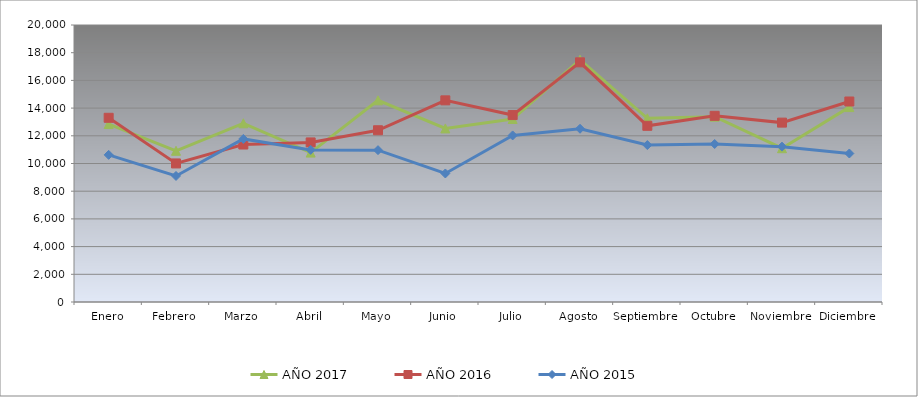
| Category | AÑO 2017 | AÑO 2016 | AÑO 2015 |
|---|---|---|---|
| Enero | 12848.046 | 13300.432 | 10624.273 |
| Febrero | 10917.859 | 10004.343 | 9100.736 |
| Marzo | 12903.846 | 11370.66 | 11773.85 |
| Abril | 10788.503 | 11521.801 | 10982.25 |
| Mayo | 14562.64 | 12400.839 | 10964.138 |
| Junio | 12532.266 | 14559.136 | 9279.725 |
| Julio | 13212.017 | 13496.311 | 12026.353 |
| Agosto | 17493.43 | 17305.071 | 12508.984 |
| Septiembre | 13262.744 | 12721.258 | 11330.64 |
| Octubre | 13381.954 | 13441.9 | 11408.415 |
| Noviembre | 11103.015 | 12952.202 | 11217.706 |
| Diciembre | 14071.85 | 14476.915 | 10722.29 |